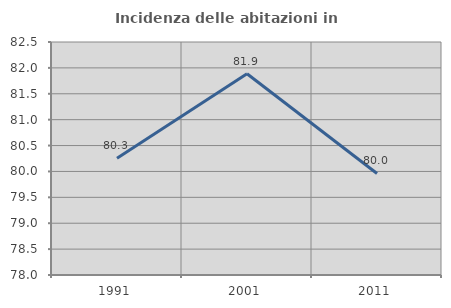
| Category | Incidenza delle abitazioni in proprietà  |
|---|---|
| 1991.0 | 80.255 |
| 2001.0 | 81.886 |
| 2011.0 | 79.961 |